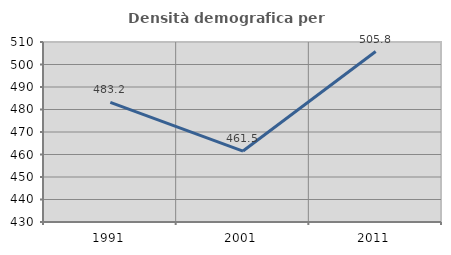
| Category | Densità demografica |
|---|---|
| 1991.0 | 483.191 |
| 2001.0 | 461.528 |
| 2011.0 | 505.753 |